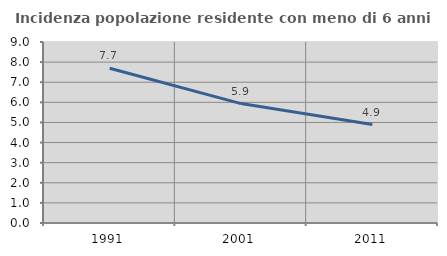
| Category | Incidenza popolazione residente con meno di 6 anni |
|---|---|
| 1991.0 | 7.697 |
| 2001.0 | 5.937 |
| 2011.0 | 4.897 |